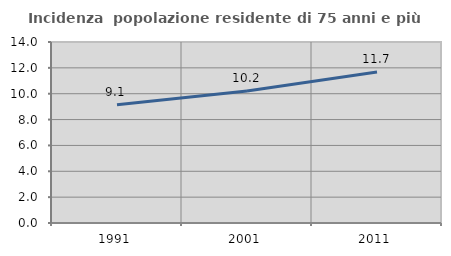
| Category | Incidenza  popolazione residente di 75 anni e più |
|---|---|
| 1991.0 | 9.142 |
| 2001.0 | 10.207 |
| 2011.0 | 11.68 |